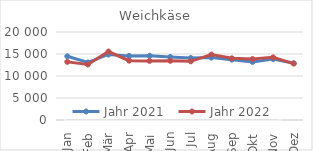
| Category | Jahr 2021 | Jahr 2022 |
|---|---|---|
| Jan | 14475.86 | 13210.712 |
| Feb | 13076.46 | 12617.794 |
| Mär | 14893.469 | 15562.046 |
| Apr | 14564.511 | 13488.659 |
| Mai | 14603.681 | 13426.012 |
| Jun | 14330.195 | 13447.547 |
| Jul | 14090.303 | 13340.485 |
| Aug | 14186.893 | 14861.396 |
| Sep | 13716.413 | 14012.122 |
| Okt | 13194.085 | 13853.218 |
| Nov | 13853.804 | 14235.076 |
| Dez | 12906.439 | 12819.596 |